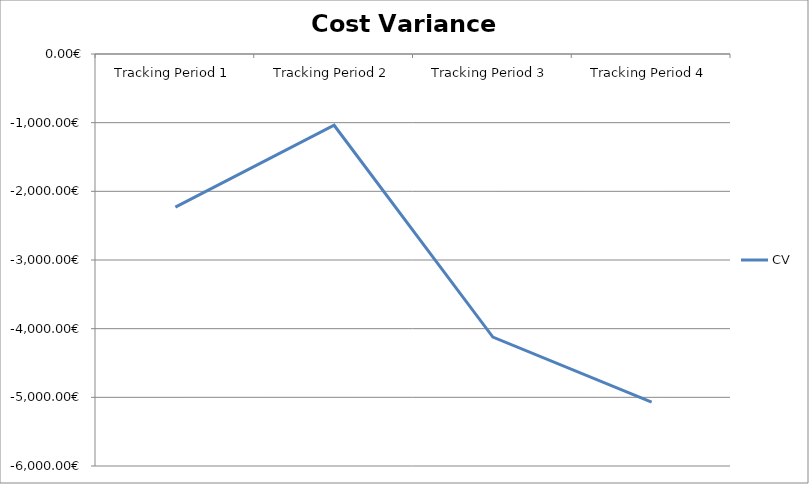
| Category | CV |
|---|---|
| Tracking Period 1 | -2229 |
| Tracking Period 2 | -1038 |
| Tracking Period 3 | -4123 |
| Tracking Period 4 | -5069 |